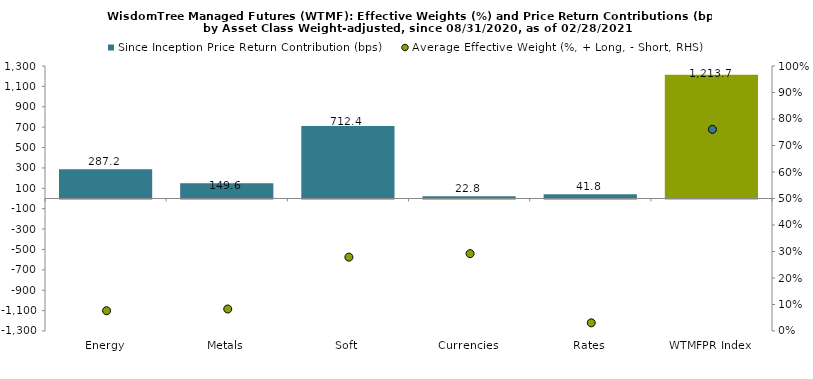
| Category | Since Inception Price Return Contribution (bps) |
|---|---|
| Energy | 287.198 |
| Metals | 149.565 |
| Soft | 712.378 |
| Currencies | 22.77 |
| Rates | 41.757 |
| WTMFPR Index | 1213.668 |